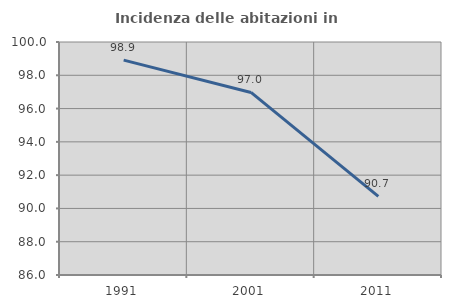
| Category | Incidenza delle abitazioni in proprietà  |
|---|---|
| 1991.0 | 98.913 |
| 2001.0 | 96.97 |
| 2011.0 | 90.722 |